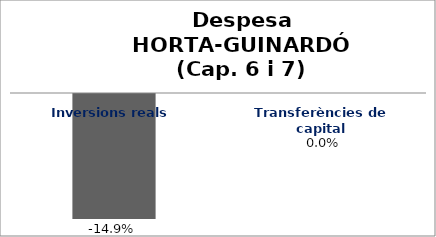
| Category | Series 0 |
|---|---|
| Inversions reals | -0.149 |
| Transferències de capital | 0 |